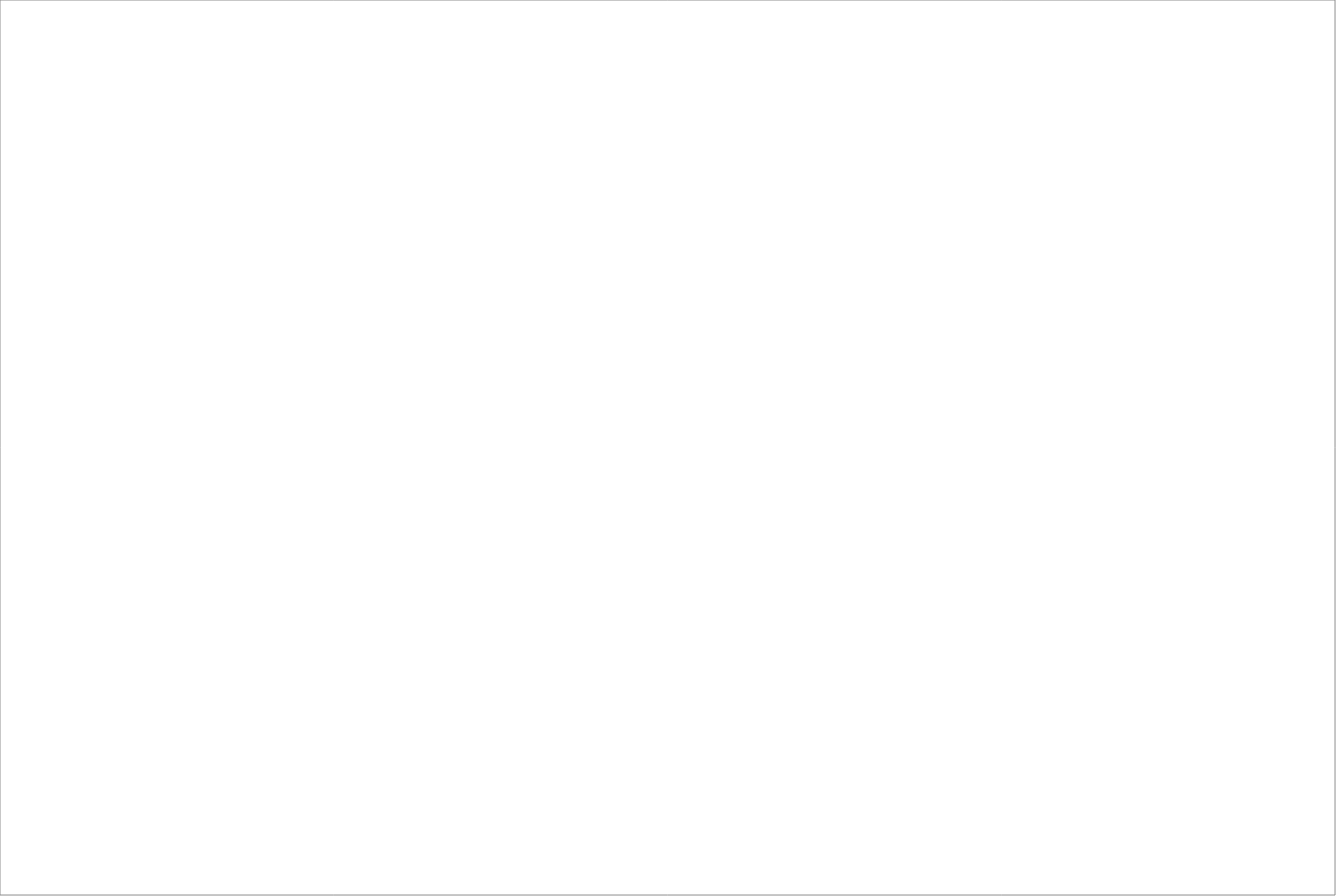
| Category | Total |
|---|---|
| Randstad AB | 70.25 |
| Poolia Sverige AB | 68.5 |
| Academic Work Sweden AB  | 62.5 |
| Experis AB | 62.5 |
| StudentConsulting Sweden AB | 42.5 |